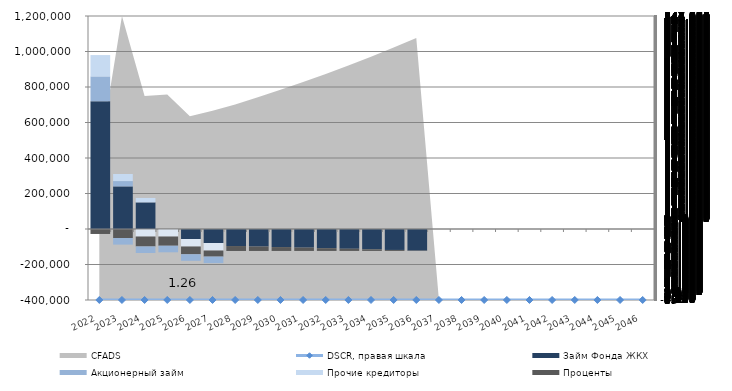
| Category | Займ Фонда ЖКХ | Акционерный займ | Прочие кредиторы | Series 5 | Series 4 | Проценты | Series 6 |
|---|---|---|---|---|---|---|---|
| 2022.0 | 720000 | 140000 | 120000 | 0 | 0 | -28000 | 0 |
| 2023.0 | 240000 | 30000 | 40000 | 0 | 0 | -51027.5 | -37000 |
| 2024.0 | 150000 | 0 | 25000 | 0 | -42500 | -55870 | -37000 |
| 2025.0 | 0 | 0 | 0 | 0 | -42500 | -51787.5 | -37000 |
| 2026.0 | 0 | 0 | 0 | -56215.762 | -42500 | -43549.3 | -37000 |
| 2027.0 | 0 | 0 | 0 | -78837.557 | -42500 | -34128.5 | -37000 |
| 2028.0 | 0 | 0 | 0 | -95967.762 | 0 | -27808.9 | 0 |
| 2029.0 | 0 | 0 | 0 | -98846.795 | 0 | -24886.7 | 0 |
| 2030.0 | 0 | 0 | 0 | -101812.199 | 0 | -21876.8 | 0 |
| 2031.0 | 0 | 0 | 0 | -104866.565 | 0 | -18776.6 | 0 |
| 2032.0 | 0 | 0 | 0 | -108012.562 | 0 | -15583.4 | 0 |
| 2033.0 | 0 | 0 | 0 | -111252.939 | 0 | -12294.4 | 0 |
| 2034.0 | 0 | 0 | 0 | -114590.527 | 0 | -8906.8 | 0 |
| 2035.0 | 0 | 0 | 0 | -118028.243 | 0 | -5417.5 | 0 |
| 2036.0 | 0 | 0 | 0 | -121569.09 | 0 | -1823.5 | 0 |
| 2037.0 | 0 | 0 | 0 | 0 | 0 | 0 | 0 |
| 2038.0 | 0 | 0 | 0 | 0 | 0 | 0 | 0 |
| 2039.0 | 0 | 0 | 0 | 0 | 0 | 0 | 0 |
| 2040.0 | 0 | 0 | 0 | 0 | 0 | 0 | 0 |
| 2041.0 | 0 | 0 | 0 | 0 | 0 | 0 | 0 |
| 2042.0 | 0 | 0 | 0 | 0 | 0 | 0 | 0 |
| 2043.0 | 0 | 0 | 0 | 0 | 0 | 0 | 0 |
| 2044.0 | 0 | 0 | 0 | 0 | 0 | 0 | 0 |
| 2045.0 | 0 | 0 | 0 | 0 | 0 | 0 | 0 |
| 2046.0 | 0 | 0 | 0 | 0 | 0 | 0 | 0 |